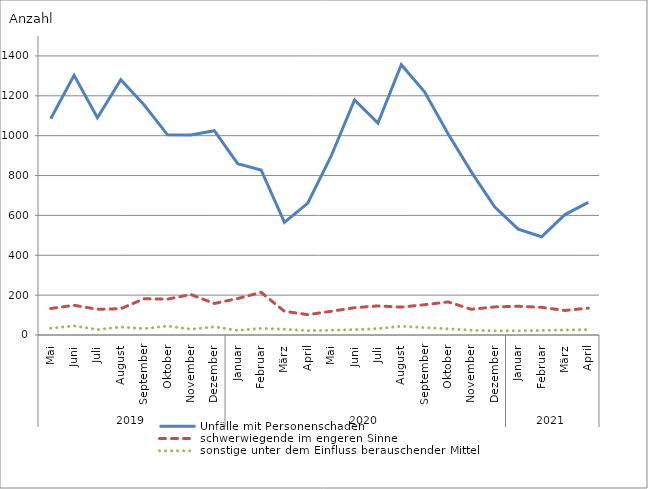
| Category | Unfälle mit Personenschaden | schwerwiegende im engeren Sinne | sonstige unter dem Einfluss berauschender Mittel |
|---|---|---|---|
| 0 | 1085 | 133 | 34 |
| 1 | 1303 | 149 | 46 |
| 2 | 1090 | 129 | 27 |
| 3 | 1281 | 132 | 40 |
| 4 | 1154 | 182 | 32 |
| 5 | 1004 | 180 | 45 |
| 6 | 1003 | 203 | 29 |
| 7 | 1025 | 158 | 41 |
| 8 | 860 | 183 | 23 |
| 9 | 828 | 214 | 33 |
| 10 | 565 | 119 | 29 |
| 11 | 662 | 102 | 22 |
| 12 | 898 | 119 | 24 |
| 13 | 1179 | 137 | 27 |
| 14 | 1063 | 146 | 32 |
| 15 | 1356 | 140 | 44 |
| 16 | 1219 | 152 | 37 |
| 17 | 1010 | 166 | 31 |
| 18 | 817 | 129 | 24 |
| 19 | 642 | 141 | 21 |
| 20 | 531 | 144 | 21 |
| 21 | 493 | 139 | 23 |
| 22 | 604 | 123 | 25 |
| 23 | 665 | 135 | 27 |